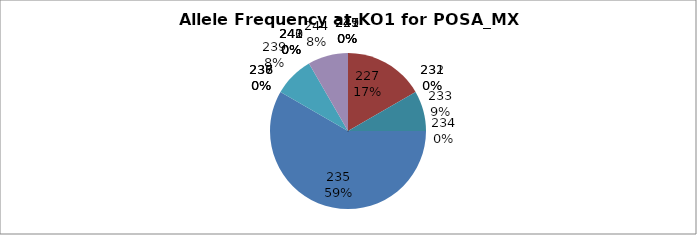
| Category | Series 0 |
|---|---|
| 221.0 | 0 |
| 227.0 | 0.167 |
| 231.0 | 0 |
| 232.0 | 0 |
| 233.0 | 0.083 |
| 234.0 | 0 |
| 235.0 | 0.583 |
| 236.0 | 0 |
| 237.0 | 0 |
| 238.0 | 0 |
| 239.0 | 0.083 |
| 240.0 | 0 |
| 241.0 | 0 |
| 242.0 | 0 |
| 243.0 | 0 |
| 244.0 | 0.083 |
| 245.0 | 0 |
| 247.0 | 0 |
| 249.0 | 0 |